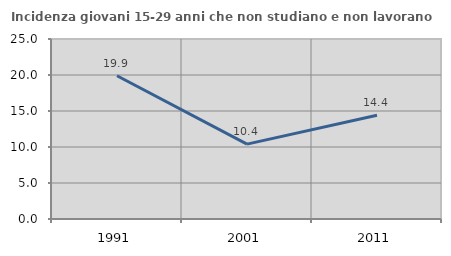
| Category | Incidenza giovani 15-29 anni che non studiano e non lavorano  |
|---|---|
| 1991.0 | 19.891 |
| 2001.0 | 10.395 |
| 2011.0 | 14.421 |